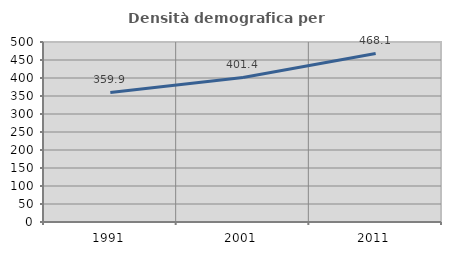
| Category | Densità demografica |
|---|---|
| 1991.0 | 359.938 |
| 2001.0 | 401.414 |
| 2011.0 | 468.136 |